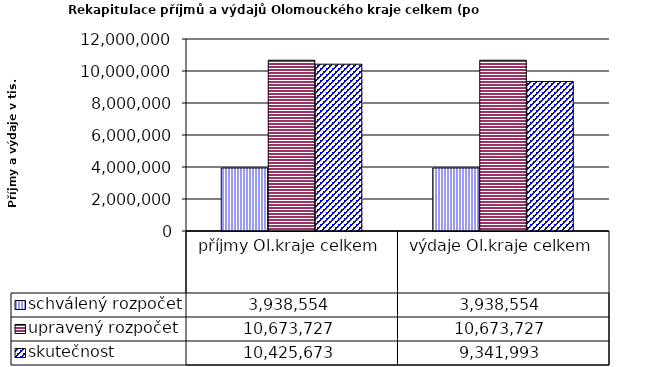
| Category | schválený rozpočet | upravený rozpočet | skutečnost |
|---|---|---|---|
| příjmy Ol.kraje celkem | 3938554 | 10673727 | 10425673 |
| výdaje Ol.kraje celkem | 3938554 | 10673727 | 9341993 |